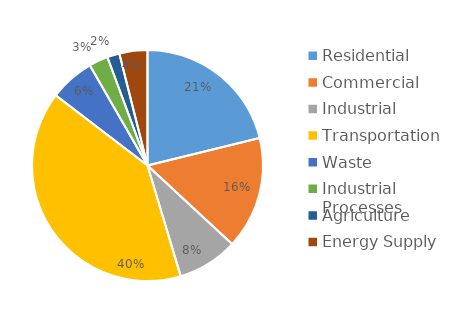
| Category | MTCO2e* |
|---|---|
| Residential | 589109.47 |
| Commercial | 437870.531 |
| Industrial | 235272.931 |
| Transportation | 1113793.058 |
| Waste | 175148.18 |
| Industrial Processes | 74458.598 |
| Agriculture | 47684.949 |
| Energy Supply | 109279.382 |